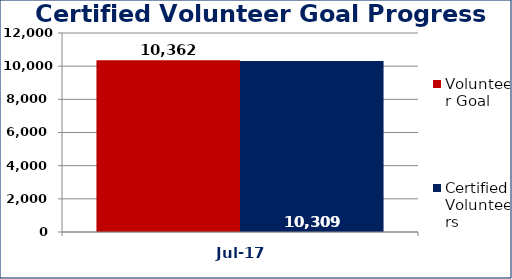
| Category | Volunteer Goal  | Certified Volunteers  |
|---|---|---|
| Jul-17 | 10362 | 10309 |